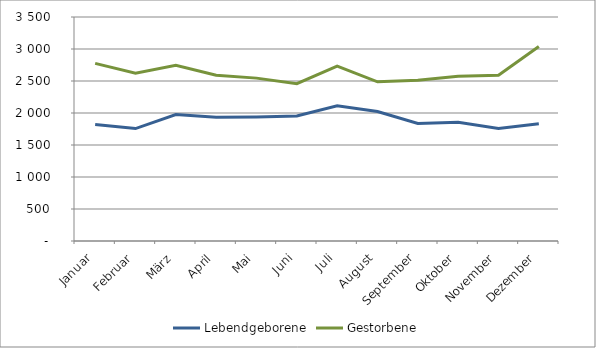
| Category | Lebendgeborene | Gestorbene |
|---|---|---|
| Januar | 1822 | 2776 |
| Februar | 1757 | 2623 |
| März | 1975 | 2747 |
| April | 1932 | 2590 |
| Mai | 1938 | 2545 |
| Juni | 1953 | 2459 |
| Juli | 2114 | 2733 |
| August | 2022 | 2487 |
| September | 1835 | 2512 |
| Oktober | 1854 | 2575 |
| November | 1758 | 2589 |
| Dezember | 1833 | 3040 |